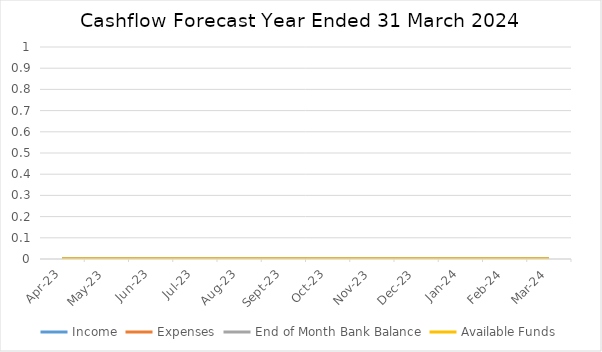
| Category | Income | Expenses | End of Month Bank Balance | Available Funds |
|---|---|---|---|---|
| 2023-04-01 | 0 | 0 | 0 | 0 |
| 2023-05-01 | 0 | 0 | 0 | 0 |
| 2023-06-01 | 0 | 0 | 0 | 0 |
| 2023-07-01 | 0 | 0 | 0 | 0 |
| 2023-08-01 | 0 | 0 | 0 | 0 |
| 2023-09-01 | 0 | 0 | 0 | 0 |
| 2023-10-01 | 0 | 0 | 0 | 0 |
| 2023-11-01 | 0 | 0 | 0 | 0 |
| 2023-12-01 | 0 | 0 | 0 | 0 |
| 2024-01-01 | 0 | 0 | 0 | 0 |
| 2024-02-01 | 0 | 0 | 0 | 0 |
| 2024-03-01 | 0 | 0 | 0 | 0 |